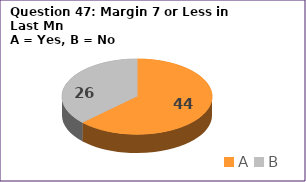
| Category | Series 0 |
|---|---|
| A | 44 |
| B | 26 |